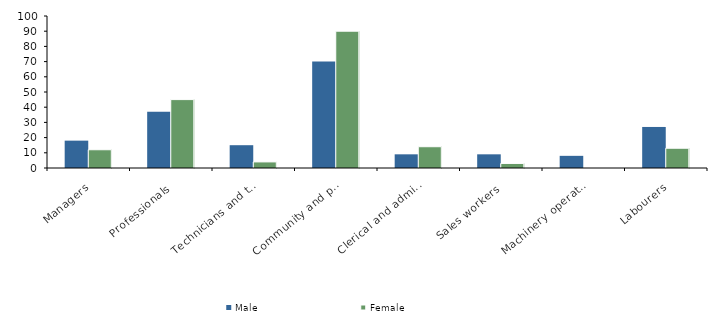
| Category | Male | Female |
|---|---|---|
| Managers | 18 | 12 |
| Professionals | 37 | 45 |
| Technicians and trades workers | 15 | 4 |
| Community and personal service workers | 70 | 90 |
| Clerical and administrative workers | 9 | 14 |
| Sales workers | 9 | 3 |
| Machinery operators and drivers | 8 | 0 |
| Labourers | 27 | 13 |